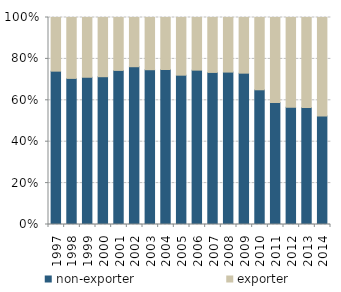
| Category | non-exporter | exporter |
|---|---|---|
| 1997.0 | 2290 | 801 |
| 1998.0 | 2500 | 1042 |
| 1999.0 | 2760 | 1120 |
| 2000.0 | 2970 | 1190 |
| 2001.0 | 2860 | 982 |
| 2002.0 | 2740 | 855 |
| 2003.0 | 3290 | 1110 |
| 2004.0 | 3210 | 1077 |
| 2005.0 | 3650 | 1410 |
| 2006.0 | 3960 | 1350 |
| 2007.0 | 4120 | 1488 |
| 2008.0 | 4710 | 1687 |
| 2009.0 | 3100 | 1140 |
| 2010.0 | 2557 | 1372 |
| 2011.0 | 2680 | 1867 |
| 2012.0 | 2044 | 1565 |
| 2013.0 | 2297 | 1763 |
| 2014.0 | 2217 | 2013 |